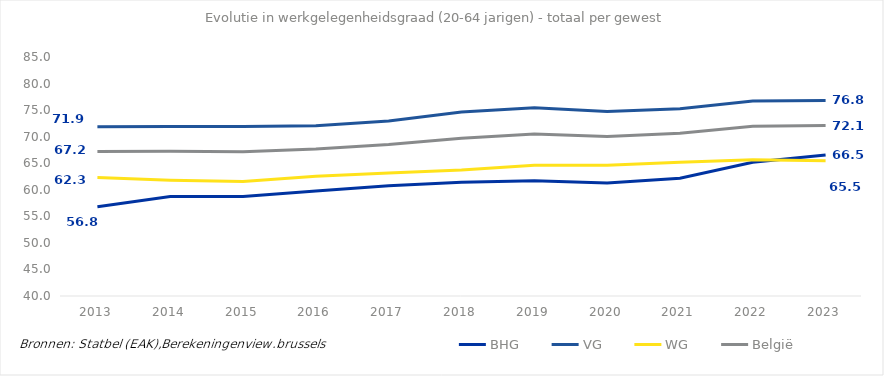
| Category | BHG | VG | WG | België |
|---|---|---|---|---|
| 2013.0 | 56.82 | 71.879 | 62.308 | 67.196 |
| 2014.0 | 58.727 | 71.936 | 61.817 | 67.274 |
| 2015.0 | 58.721 | 71.92 | 61.542 | 67.171 |
| 2016.0 | 59.757 | 72.033 | 62.569 | 67.677 |
| 2017.0 | 60.762 | 72.969 | 63.16 | 68.513 |
| 2018.0 | 61.439 | 74.642 | 63.717 | 69.722 |
| 2019.0 | 61.679 | 75.451 | 64.628 | 70.497 |
| 2020.0 | 61.296 | 74.726 | 64.604 | 70.027 |
| 2021.0 | 62.19 | 75.271 | 65.197 | 70.624 |
| 2022.0 | 65.171 | 76.734 | 65.655 | 71.941 |
| 2023.0 | 66.544 | 76.818 | 65.461 | 72.087 |